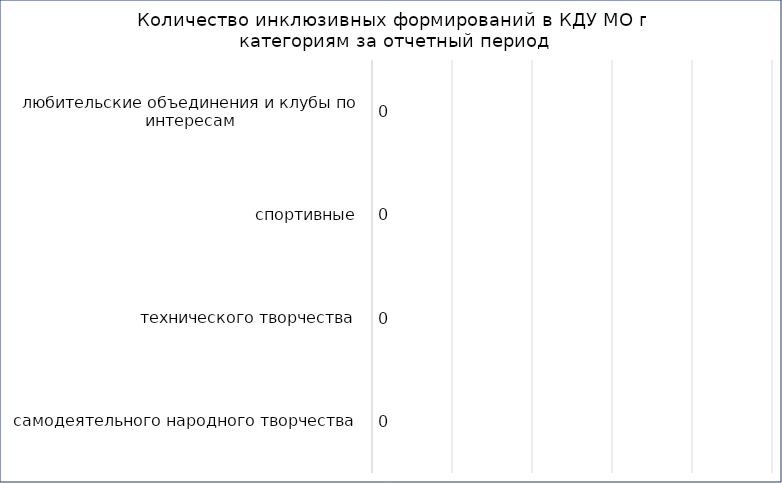
| Category | Series 2 |
|---|---|
| самодеятельного народного творчества | 0 |
| технического творчества | 0 |
| спортивные | 0 |
| любительские объединения и клубы по интересам | 0 |